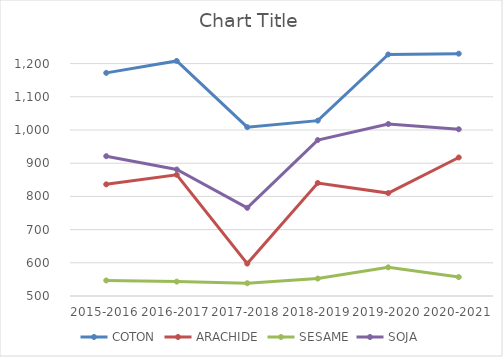
| Category |  COTON  |  ARACHIDE  |  SESAME  |  SOJA  |
|---|---|---|---|---|
| 2015-2016 | 1172.034 | 836.27 | 546.789 | 921.186 |
| 2016-2017 | 1207.989 | 865.091 | 543.312 | 881.021 |
| 2017-2018 | 1008.562 | 597.583 | 538.481 | 765.535 |
| 2018-2019 | 1028.25 | 840.43 | 552.541 | 969.611 |
| 2019-2020 | 1227.458 | 809.988 | 586.328 | 1018.021 |
| 2020-2021 | 1229.947 | 917.261 | 557.031 | 1002.253 |